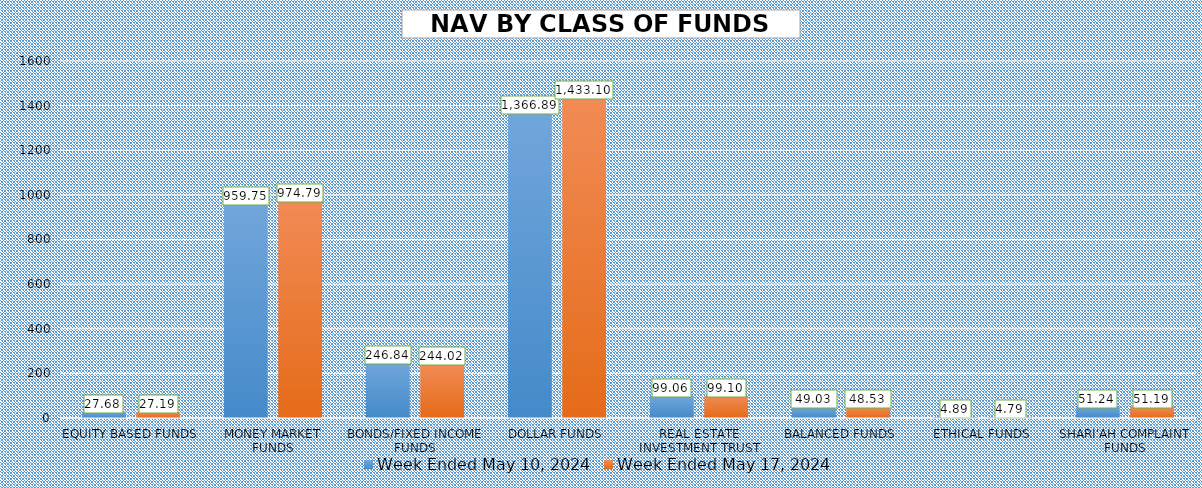
| Category | Week Ended May 10, 2024 | Week Ended May 17, 2024 |
|---|---|---|
| EQUITY BASED FUNDS | 27.676 | 27.188 |
| MONEY MARKET FUNDS | 959.754 | 974.789 |
| BONDS/FIXED INCOME FUNDS | 246.839 | 244.017 |
| DOLLAR FUNDS | 1366.889 | 1433.1 |
| REAL ESTATE INVESTMENT TRUST | 99.061 | 99.095 |
| BALANCED FUNDS | 49.029 | 48.528 |
| ETHICAL FUNDS | 4.887 | 4.792 |
| SHARI'AH COMPLAINT FUNDS | 51.244 | 51.188 |